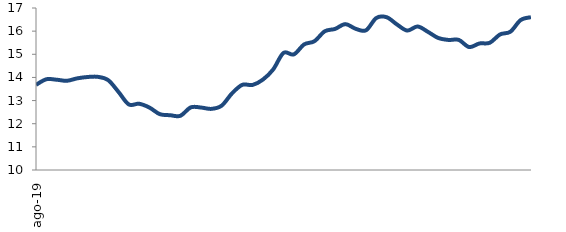
| Category | Series 0 |
|---|---|
| 2019-08-01 | 13.679 |
| 2019-09-01 | 13.92 |
| 2019-10-01 | 13.901 |
| 2019-11-01 | 13.855 |
| 2019-12-01 | 13.96 |
| 2020-01-01 | 14.019 |
| 2020-02-01 | 14.026 |
| 2020-03-01 | 13.882 |
| 2020-04-01 | 13.374 |
| 2020-05-01 | 12.833 |
| 2020-06-01 | 12.862 |
| 2020-07-01 | 12.698 |
| 2020-08-01 | 12.414 |
| 2020-09-01 | 12.367 |
| 2020-10-01 | 12.342 |
| 2020-11-01 | 12.705 |
| 2020-12-01 | 12.699 |
| 2021-01-01 | 12.641 |
| 2021-02-01 | 12.779 |
| 2021-03-01 | 13.308 |
| 2021-04-01 | 13.679 |
| 2021-05-01 | 13.675 |
| 2021-06-01 | 13.905 |
| 2021-07-01 | 14.345 |
| 2021-08-01 | 15.059 |
| 2021-09-01 | 14.995 |
| 2021-10-01 | 15.427 |
| 2021-11-01 | 15.564 |
| 2021-12-01 | 15.993 |
| 2022-01-01 | 16.097 |
| 2022-02-01 | 16.304 |
| 2022-03-01 | 16.101 |
| 2022-04-01 | 16.037 |
| 2022-05-01 | 16.568 |
| 2022-06-01 | 16.602 |
| 2022-07-01 | 16.29 |
| 2022-08-01 | 16.026 |
| 2022-09-01 | 16.201 |
| 2022-10-01 | 15.97 |
| 2022-11-01 | 15.706 |
| 2022-12-01 | 15.62 |
| 2023-01-01 | 15.621 |
| 2023-02-01 | 15.312 |
| 2023-03-01 | 15.467 |
| 2023-04-01 | 15.498 |
| 2023-05-01 | 15.858 |
| 2023-06-01 | 15.975 |
| 2023-07-01 | 16.48 |
| 2023-08-01 | 16.604 |